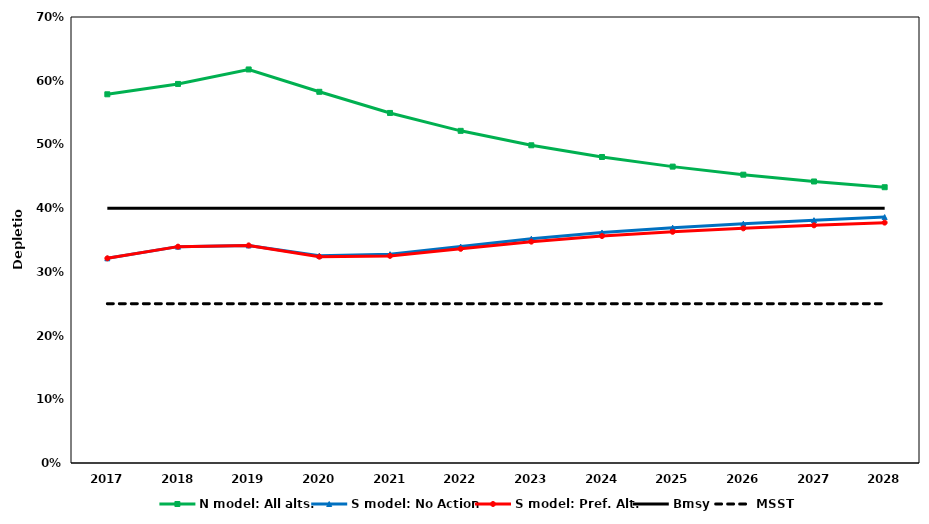
| Category | N model: All alts. | S model: No Action | S model: Pref. Alt. | Bmsy | MSST |
|---|---|---|---|---|---|
| 2017.0 | 0.579 | 0.321 | 0.321 | 0.4 | 0.25 |
| 2018.0 | 0.595 | 0.34 | 0.34 | 0.4 | 0.25 |
| 2019.0 | 0.618 | 0.341 | 0.341 | 0.4 | 0.25 |
| 2020.0 | 0.583 | 0.325 | 0.324 | 0.4 | 0.25 |
| 2021.0 | 0.549 | 0.328 | 0.325 | 0.4 | 0.25 |
| 2022.0 | 0.521 | 0.34 | 0.336 | 0.4 | 0.25 |
| 2023.0 | 0.499 | 0.352 | 0.347 | 0.4 | 0.25 |
| 2024.0 | 0.48 | 0.362 | 0.356 | 0.4 | 0.25 |
| 2025.0 | 0.465 | 0.369 | 0.363 | 0.4 | 0.25 |
| 2026.0 | 0.453 | 0.376 | 0.368 | 0.4 | 0.25 |
| 2027.0 | 0.442 | 0.381 | 0.373 | 0.4 | 0.25 |
| 2028.0 | 0.433 | 0.386 | 0.377 | 0.4 | 0.25 |